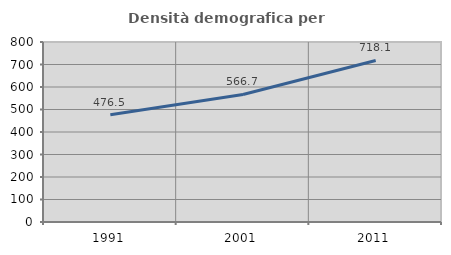
| Category | Densità demografica |
|---|---|
| 1991.0 | 476.499 |
| 2001.0 | 566.678 |
| 2011.0 | 718.105 |